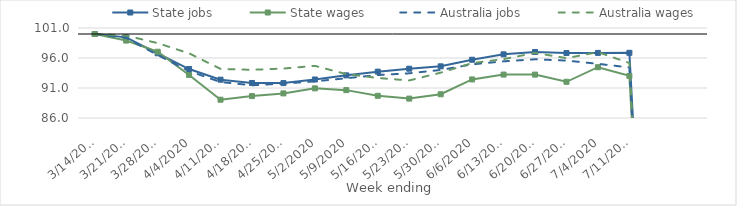
| Category | State jobs | State wages | Australia jobs | Australia wages |
|---|---|---|---|---|
| 14/03/2020 | 100 | 100 | 100 | 100 |
| 21/03/2020 | 99.439 | 98.903 | 99.345 | 99.743 |
| 28/03/2020 | 96.787 | 97.046 | 96.491 | 98.481 |
| 04/04/2020 | 94.159 | 93.174 | 93.819 | 96.778 |
| 11/04/2020 | 92.385 | 89.05 | 91.996 | 94.184 |
| 18/04/2020 | 91.837 | 89.654 | 91.451 | 94.032 |
| 25/04/2020 | 91.814 | 90.102 | 91.738 | 94.241 |
| 02/05/2020 | 92.421 | 90.942 | 92.109 | 94.689 |
| 09/05/2020 | 93.108 | 90.645 | 92.629 | 93.316 |
| 16/05/2020 | 93.727 | 89.698 | 93.158 | 92.67 |
| 23/05/2020 | 94.214 | 89.234 | 93.449 | 92.26 |
| 30/05/2020 | 94.61 | 89.954 | 94.006 | 93.552 |
| 06/06/2020 | 95.71 | 92.429 | 94.942 | 95.15 |
| 13/06/2020 | 96.61 | 93.238 | 95.443 | 95.811 |
| 20/06/2020 | 97.005 | 93.23 | 95.785 | 96.851 |
| 27/06/2020 | 96.826 | 92.035 | 95.571 | 95.974 |
| 04/07/2020 | 96.852 | 94.464 | 95.033 | 96.971 |
| 11/07/2020 | 96.865 | 93.021 | 94.423 | 95.167 |